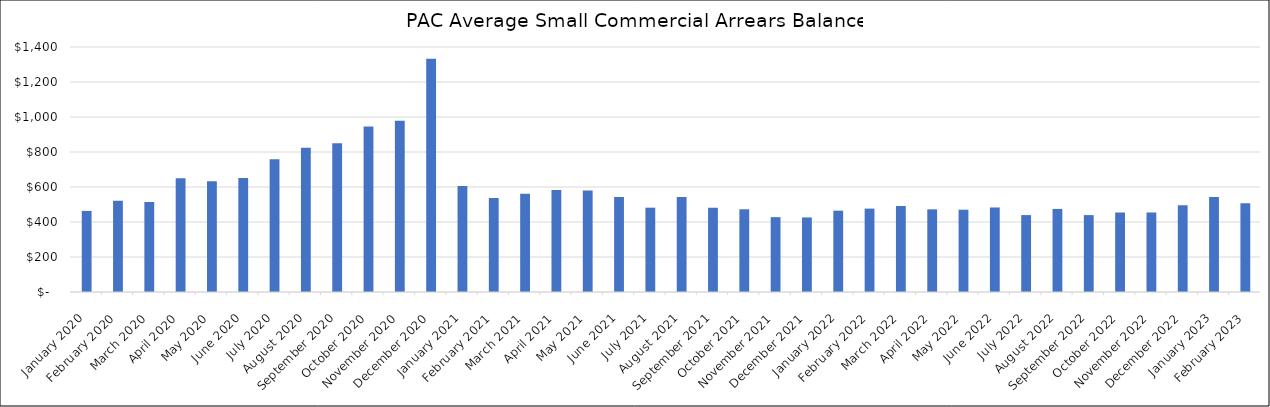
| Category | Average Arrears Balance |
|---|---|
| 2020-01-01 | 463.4 |
| 2020-02-01 | 521.692 |
| 2020-03-01 | 514.52 |
| 2020-04-01 | 649.469 |
| 2020-05-01 | 633.316 |
| 2020-06-01 | 652.096 |
| 2020-07-01 | 758.921 |
| 2020-08-01 | 824.905 |
| 2020-09-01 | 849.783 |
| 2020-10-01 | 945.284 |
| 2020-11-01 | 978.839 |
| 2020-12-01 | 1332.879 |
| 2021-01-01 | 605.5 |
| 2021-02-01 | 537.3 |
| 2021-03-01 | 562.082 |
| 2021-04-01 | 582.85 |
| 2021-05-01 | 580.498 |
| 2021-06-01 | 542.696 |
| 2021-07-01 | 481.836 |
| 2021-08-01 | 542.696 |
| 2021-09-01 | 481.495 |
| 2021-10-01 | 472.7 |
| 2021-11-01 | 427.654 |
| 2021-12-01 | 426.021 |
| 2022-01-01 | 464.75 |
| 2022-02-01 | 476.46 |
| 2022-03-01 | 490.99 |
| 2022-04-01 | 472.32 |
| 2022-05-01 | 470.284 |
| 2022-06-01 | 483.015 |
| 2022-07-01 | 439.424 |
| 2022-08-01 | 474.725 |
| 2022-09-01 | 439.424 |
| 2022-10-01 | 454.33 |
| 2022-11-01 | 454.52 |
| 2022-12-01 | 496.017 |
| 2023-01-01 | 542.281 |
| 2023-02-01 | 507.275 |